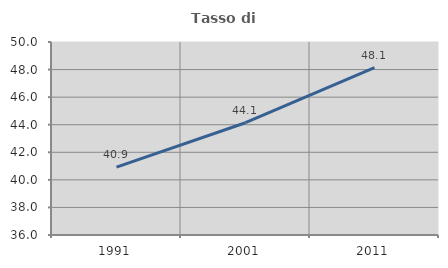
| Category | Tasso di occupazione   |
|---|---|
| 1991.0 | 40.929 |
| 2001.0 | 44.145 |
| 2011.0 | 48.148 |